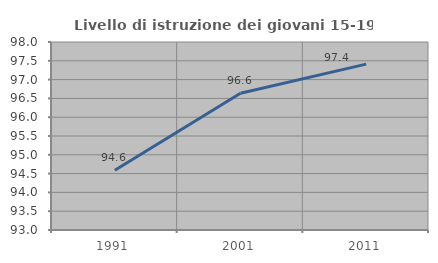
| Category | Livello di istruzione dei giovani 15-19 anni |
|---|---|
| 1991.0 | 94.59 |
| 2001.0 | 96.637 |
| 2011.0 | 97.411 |